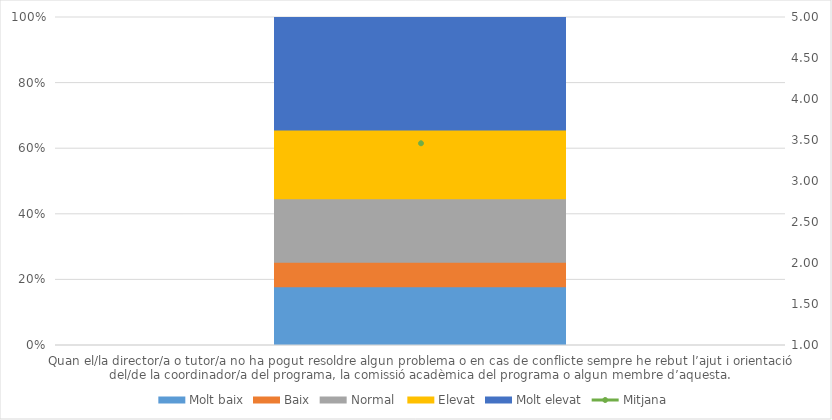
| Category | Molt baix | Baix | Normal  | Elevat | Molt elevat |
|---|---|---|---|---|---|
| Quan el/la director/a o tutor/a no ha pogut resoldre algun problema o en cas de conflicte sempre he rebut l’ajut i orientació del/de la coordinador/a del programa, la comissió acadèmica del programa o algun membre d’aquesta. | 12 | 5 | 13 | 14 | 23 |